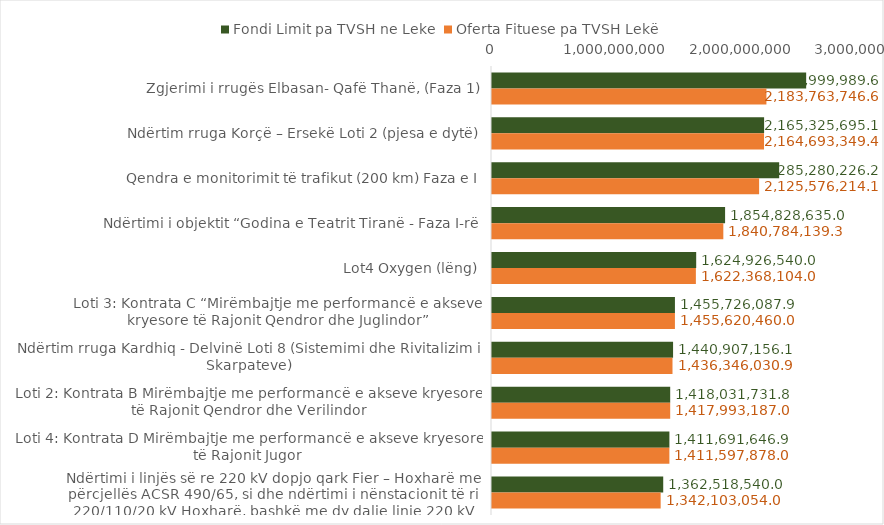
| Category | Fondi Limit pa TVSH ne Leke | Oferta Fituese pa TVSH Lekë |
|---|---|---|
| Zgjerimi i rrugës Elbasan- Qafë Thanë, (Faza 1) | 2499999989.6 | 2183763746.61 |
| Ndërtim rruga Korçë – Ersekë Loti 2 (pjesa e dytë) | 2165325695.08 | 2164693349.44 |
| Qendra e monitorimit të trafikut (200 km) Faza e I | 2285280226.24 | 2125576214.05 |
| Ndërtimi i objektit “Godina e Teatrit Tiranë - Faza I-rë | 1854828635 | 1840784139.32 |
| Lot4 Oxygen (lëng) | 1624926540 | 1622368104 |
| Loti 3: Kontrata C “Mirëmbajtje me performancë e akseve kryesore të Rajonit Qendror dhe Juglindor” | 1455726087.9 | 1455620460 |
| Ndërtim rruga Kardhiq - Delvinë Loti 8 (Sistemimi dhe Rivitalizim i Skarpateve) | 1440907156.1 | 1436346030.87 |
| Loti 2: Kontrata B Mirëmbajtje me performancë e akseve kryesore të Rajonit Qendror dhe Verilindor | 1418031731.76 | 1417993187 |
| Loti 4: Kontrata D Mirëmbajtje me performancë e akseve kryesore të Rajonit Jugor | 1411691646.86 | 1411597878 |
| Ndërtimi i linjës së re 220 kV dopjo qark Fier – Hoxharë me përcjellës ACSR 490/65, si dhe ndërtimi i nënstacionit të ri 220/110/20 kV Hoxharë, bashkë me dy dalje linje 220 kV | 1362518540 | 1342103054 |